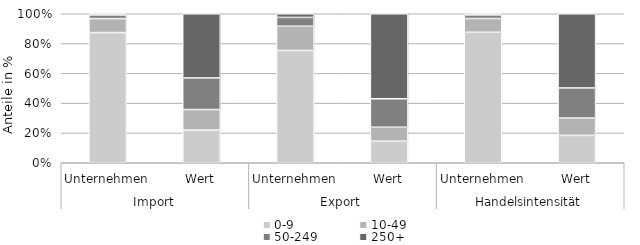
| Category | 0-9 | 10-49 | 50-249 | 250+ |
|---|---|---|---|---|
| 0 | 139171 | 14925 | 3839 | 1338 |
| 1 | 38299.116 | 24045.714 | 37082.943 | 75203.564 |
| 2 | 28217 | 6101 | 2215 | 920 |
| 3 | 23427.991 | 15198.074 | 30911.062 | 92377.162 |
| 4 | 143429 | 15163 | 3880 | 1345 |
| 5 | 61727.107 | 39243.789 | 67994.005 | 167580.726 |